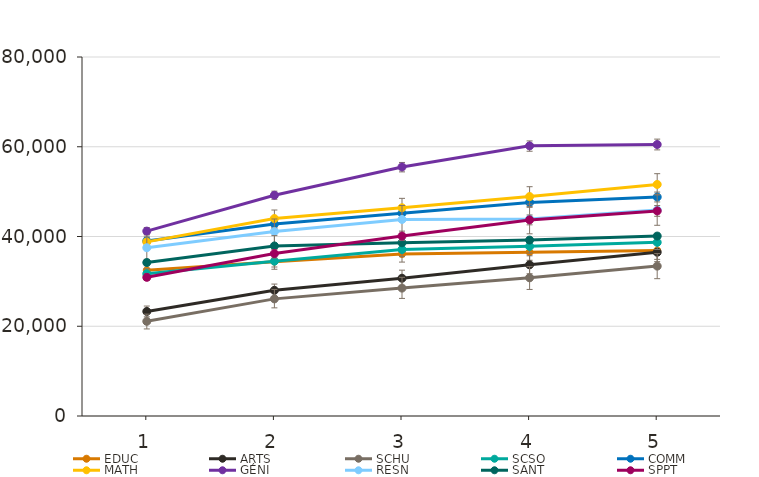
| Category | EDUC | ARTS | SCHU | SCSO | COMM | MATH | GÉNI | RESN | SANT | SPPT |
|---|---|---|---|---|---|---|---|---|---|---|
| 1.0 | 32500 | 23300 | 21100 | 31700 | 39000 | 38800 | 41200 | 37500 | 34200 | 30900 |
| 2.0 | 34400 | 28000 | 26100 | 34500 | 42800 | 44000 | 49200 | 41100 | 37900 | 36200 |
| 3.0 | 36100 | 30700 | 28500 | 37100 | 45200 | 46400 | 55500 | 43800 | 38600 | 40100 |
| 4.0 | 36500 | 33700 | 30800 | 37800 | 47600 | 48900 | 60200 | 43900 | 39200 | 43700 |
| 5.0 | 36900 | 36500 | 33400 | 38700 | 48800 | 51600 | 60500 | 45900 | 40100 | 45700 |